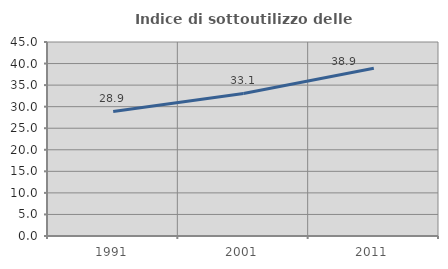
| Category | Indice di sottoutilizzo delle abitazioni  |
|---|---|
| 1991.0 | 28.883 |
| 2001.0 | 33.067 |
| 2011.0 | 38.92 |